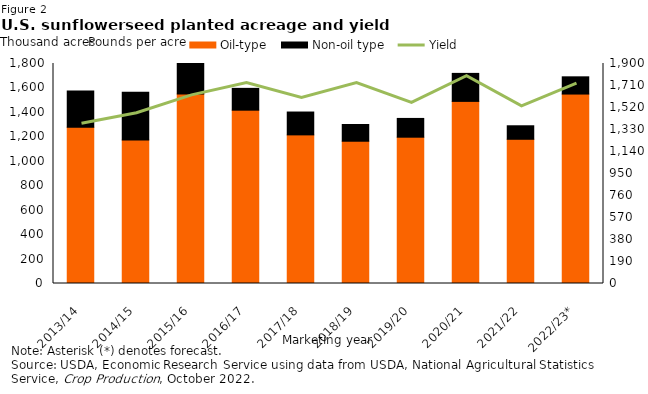
| Category | Oil-type | Non-oil type |
|---|---|---|
| 2013/14 | 1279 | 296.5 |
| 2014/15 | 1174 | 391.3 |
| 2015/16 | 1550.5 | 309.6 |
| 2016/17 | 1418 | 178.6 |
| 2017/18 | 1216 | 187 |
| 2018/19 | 1164 | 137 |
| 2019/20 | 1197 | 153.6 |
| 2020/21 | 1490 | 229.1 |
| 2021/22 | 1180 | 110.5 |
| 2022/23* | 1550 | 141 |